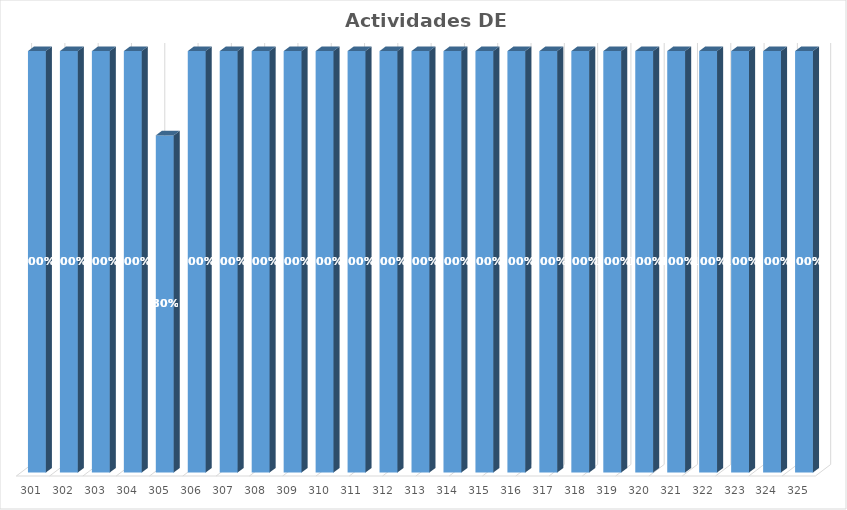
| Category | % Avance |
|---|---|
| 301.0 | 1 |
| 302.0 | 1 |
| 303.0 | 1 |
| 304.0 | 1 |
| 305.0 | 0.8 |
| 306.0 | 1 |
| 307.0 | 1 |
| 308.0 | 1 |
| 309.0 | 1 |
| 310.0 | 1 |
| 311.0 | 1 |
| 312.0 | 1 |
| 313.0 | 1 |
| 314.0 | 1 |
| 315.0 | 1 |
| 316.0 | 1 |
| 317.0 | 1 |
| 318.0 | 1 |
| 319.0 | 1 |
| 320.0 | 1 |
| 321.0 | 1 |
| 322.0 | 1 |
| 323.0 | 1 |
| 324.0 | 1 |
| 325.0 | 1 |